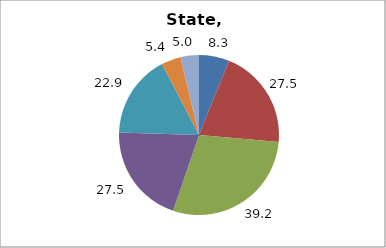
| Category | Series 0 |
|---|---|
| Higher Education | 8.328 |
| Elementary and Secondary Education | 27.537 |
| Total Education1 | 39.22 |
| Social Welfare2 | 27.474 |
| Transportation, Public Safety, Environment and Housing3 | 22.889 |
| Administration | 5.372 |
| Other4 | 5.045 |